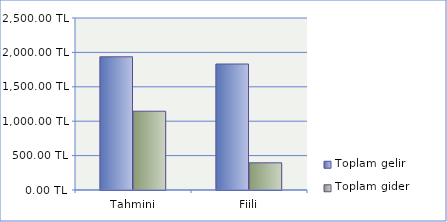
| Category | Toplam gelir | Toplam gider |
|---|---|---|
| Tahmini | 1936 | 1145 |
| Fiili | 1831 | 395 |